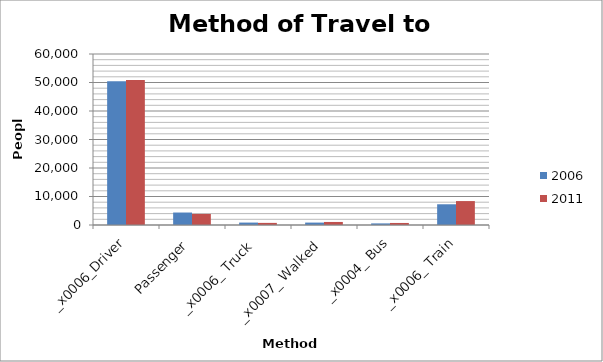
| Category | 2006 | 2011 |
|---|---|---|
| 0 | 50414 | 50910 |
| 1 | 4376 | 3886 |
| 2 | 849 | 741 |
| 3 | 845 | 1066 |
| 4 | 562 | 716 |
| 5 | 7273 | 8397 |